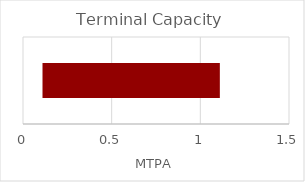
| Category | Series 0 | Series 1 |
|---|---|---|
| Size of Demand Center | 0.11 | 1 |